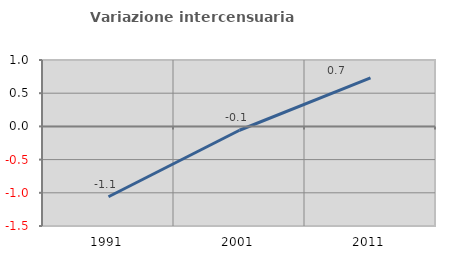
| Category | Variazione intercensuaria annua |
|---|---|
| 1991.0 | -1.059 |
| 2001.0 | -0.058 |
| 2011.0 | 0.729 |